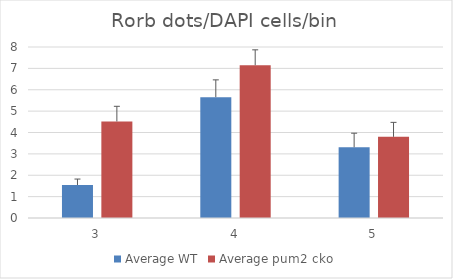
| Category | Average WT | Average pum2 cko |
|---|---|---|
| 3.0 | 1.544 | 4.517 |
| 4.0 | 5.653 | 7.147 |
| 5.0 | 3.309 | 3.797 |